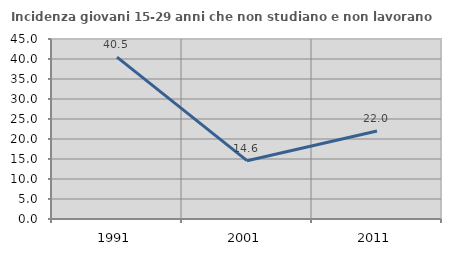
| Category | Incidenza giovani 15-29 anni che non studiano e non lavorano  |
|---|---|
| 1991.0 | 40.462 |
| 2001.0 | 14.583 |
| 2011.0 | 21.986 |